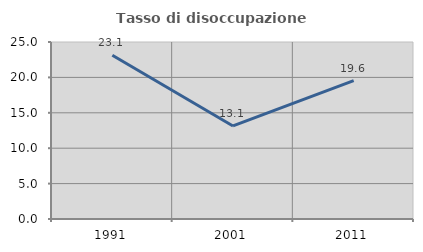
| Category | Tasso di disoccupazione giovanile  |
|---|---|
| 1991.0 | 23.119 |
| 2001.0 | 13.144 |
| 2011.0 | 19.553 |